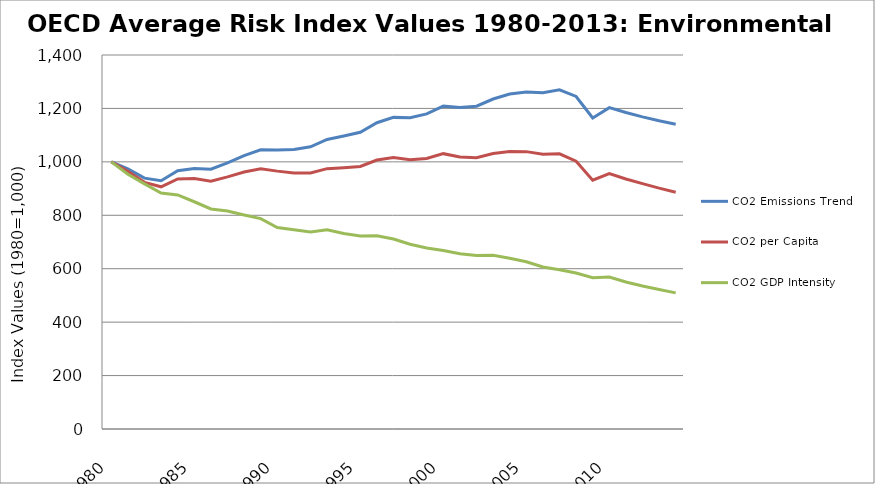
| Category | CO2 Emissions Trend | CO2 per Capita | CO2 GDP Intensity |
|---|---|---|---|
| 1980.0 | 1000 | 1000 | 1000 |
| 1981.0 | 973.56 | 965.069 | 953.671 |
| 1982.0 | 939.045 | 923.28 | 917.483 |
| 1983.0 | 929.299 | 906.651 | 883.345 |
| 1984.0 | 966.645 | 936.18 | 875.998 |
| 1985.0 | 974.987 | 937.316 | 850.66 |
| 1986.0 | 972.544 | 927.858 | 823.6 |
| 1987.0 | 996.568 | 943.641 | 816.204 |
| 1988.0 | 1023.665 | 961.926 | 801.32 |
| 1989.0 | 1045.06 | 974.106 | 787.576 |
| 1990.0 | 1044.509 | 965.279 | 754.092 |
| 1991.0 | 1046.171 | 957.947 | 745.917 |
| 1992.0 | 1056.511 | 958.532 | 737.794 |
| 1993.0 | 1083.707 | 974.643 | 745.989 |
| 1994.0 | 1096.762 | 978.299 | 731.897 |
| 1995.0 | 1110.854 | 982.98 | 722.328 |
| 1996.0 | 1146.444 | 1006.668 | 723.659 |
| 1997.0 | 1166.504 | 1016.501 | 710.953 |
| 1998.0 | 1165.207 | 1008.052 | 691.702 |
| 1999.0 | 1179.359 | 1012.923 | 677.57 |
| 2000.0 | 1208.574 | 1030.664 | 667.802 |
| 2001.0 | 1203.17 | 1018.576 | 656.324 |
| 2002.0 | 1208.518 | 1015.751 | 649.081 |
| 2003.0 | 1235.274 | 1030.925 | 650.042 |
| 2004.0 | 1253.646 | 1038.929 | 639.087 |
| 2005.0 | 1261.575 | 1038.277 | 626.24 |
| 2006.0 | 1258.352 | 1028.378 | 606.528 |
| 2007.0 | 1269.584 | 1030.179 | 596.308 |
| 2008.0 | 1244.807 | 1002.603 | 583.823 |
| 2009.0 | 1164.471 | 931.638 | 566.514 |
| 2010.0 | 1202.963 | 956.427 | 568.767 |
| 2011.0 | 1184.73 | 935.669 | 550.494 |
| 2012.0 | 1168.298 | 918.465 | 535.192 |
| 2013.0 | 1153.656 | 901.722 | 521.917 |
| 2014.0 | 1140.798 | 886.506 | 509.609 |